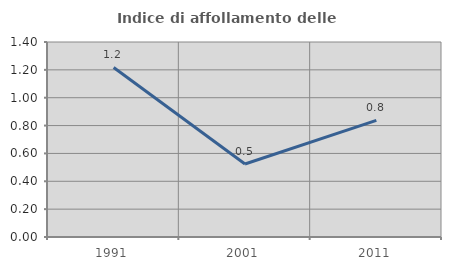
| Category | Indice di affollamento delle abitazioni  |
|---|---|
| 1991.0 | 1.217 |
| 2001.0 | 0.524 |
| 2011.0 | 0.837 |